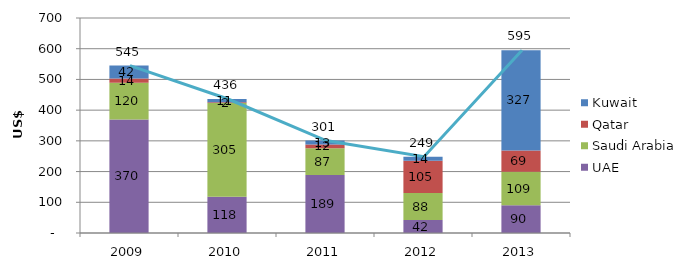
| Category | UAE | Saudi Arabia | Qatar | Kuwait |
|---|---|---|---|---|
| 2009.0 | 369.771 | 119.59 | 13.579 | 42.23 |
| 2010.0 | 118.18 | 305.004 | 2.119 | 10.995 |
| 2011.0 | 188.72 | 86.984 | 12.133 | 13.29 |
| 2012.0 | 42.249 | 87.835 | 104.943 | 13.522 |
| 2013.0 | 90.052 | 109.132 | 69.173 | 326.501 |